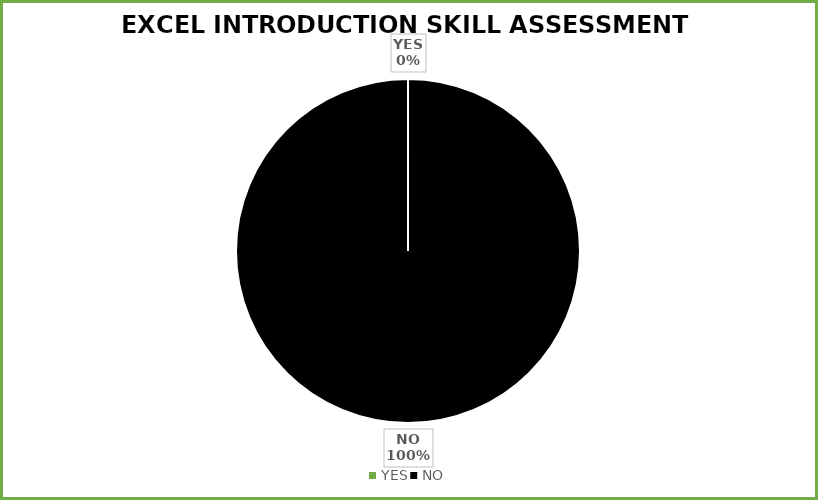
| Category | Series 0 |
|---|---|
| YES | 0 |
| NO | 38 |